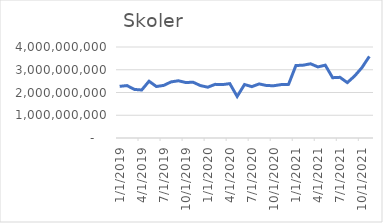
| Category | Skoler |
|---|---|
| 1/1/19 | 2270445416.667 |
| 2/1/19 | 2304087083.333 |
| 3/1/19 | 2135068333.333 |
| 4/1/19 | 2110368333.333 |
| 5/1/19 | 2495947083.333 |
| 6/1/19 | 2262695416.667 |
| 7/1/19 | 2312342083.333 |
| 8/1/19 | 2465971250 |
| 9/1/19 | 2515910416.667 |
| 10/1/19 | 2438585416.667 |
| 11/1/19 | 2451622916.667 |
| 12/1/19 | 2303981250 |
| 1/1/20 | 2232922916.667 |
| 2/1/20 | 2358089583.333 |
| 3/1/20 | 2346522916.667 |
| 4/1/20 | 2390297916.667 |
| 5/1/20 | 1826208333.333 |
| 6/1/20 | 2351208333.333 |
| 7/1/20 | 2257658333.333 |
| 8/1/20 | 2378141666.667 |
| 9/1/20 | 2306250000 |
| 10/1/20 | 2297891666.667 |
| 11/1/20 | 2348250000 |
| 12/1/20 | 2356875000 |
| 1/1/21 | 3184983333.333 |
| 2/1/21 | 3201225000 |
| 3/1/21 | 3262350000 |
| 4/1/21 | 3124350000 |
| 5/1/21 | 3201570833.333 |
| 6/1/21 | 2650629166.667 |
| 7/1/21 | 2666679166.667 |
| 8/1/21 | 2434529166.667 |
| 9/1/21 | 2725304166.667 |
| 10/1/21 | 3096229166.667 |
| 11/1/21 | 3586450000 |